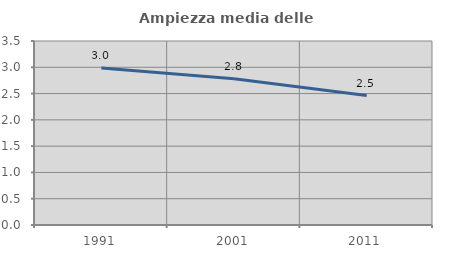
| Category | Ampiezza media delle famiglie |
|---|---|
| 1991.0 | 2.985 |
| 2001.0 | 2.784 |
| 2011.0 | 2.461 |